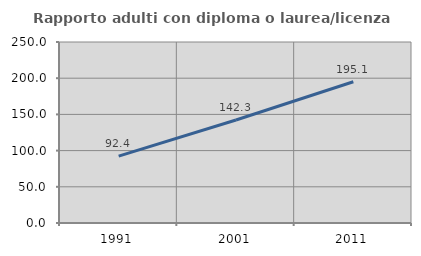
| Category | Rapporto adulti con diploma o laurea/licenza media  |
|---|---|
| 1991.0 | 92.448 |
| 2001.0 | 142.327 |
| 2011.0 | 195.069 |